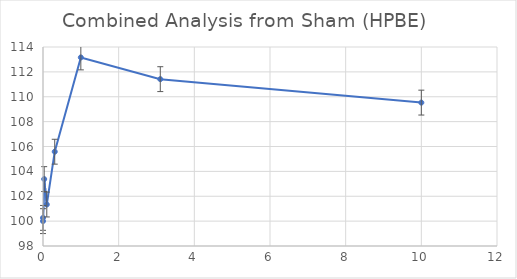
| Category | Combined Analysis from Sham (HPBE) |
|---|---|
| 10.0 | 109.529 |
| 3.1 | 111.415 |
| 1.0 | 113.161 |
| 0.31 | 105.581 |
| 0.1 | 101.336 |
| 0.031 | 103.38 |
| 0.0 | 100 |
| 0.0 | 100.261 |